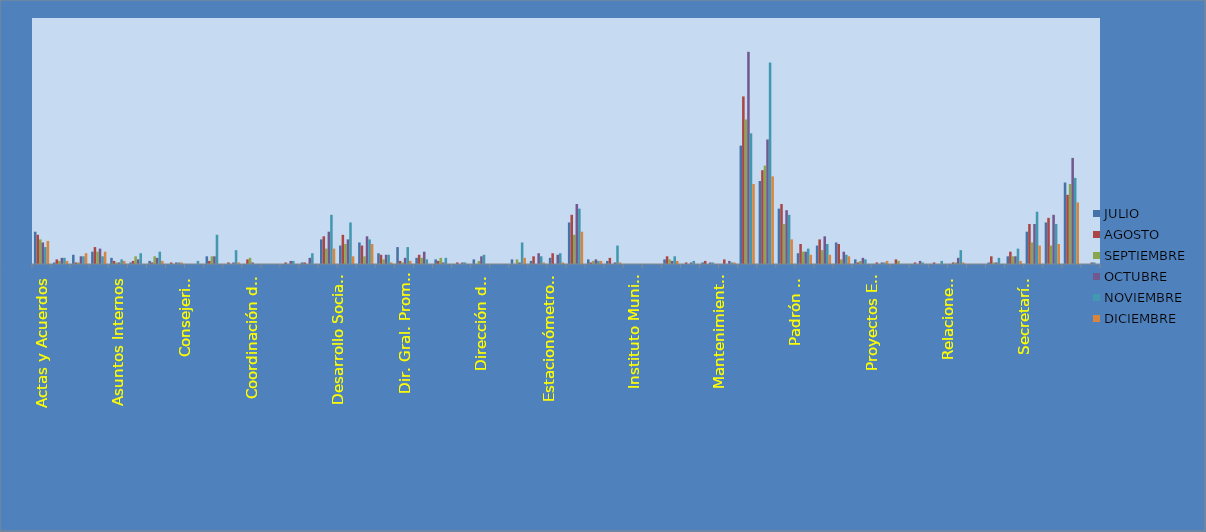
| Category | JULIO | AGOSTO | SEPTIEMBRE | OCTUBRE | NOVIEMBRE | DICIEMBRE |
|---|---|---|---|---|---|---|
| Actas y Acuerdos | 21 | 19 | 16 | 14 | 11 | 15 |
| Agua y Alcantarillado | 1 | 3 | 2 | 4 | 4 | 2 |
| Alumbrado Público | 6 | 1 | 1 | 5 | 5 | 7 |
| Archivo Municipal | 8 | 11 | 8 | 10 | 5 | 8 |
| Asuntos Internos | 4 | 2 | 1 | 1 | 3 | 2 |
| Atención Ciudadana | 1 | 2 | 5 | 3 | 7 | 0 |
| Comunicación Social | 2 | 1 | 5 | 4 | 8 | 2 |
| Comunidad Digna | 0 | 1 | 0 | 1 | 1 | 1 |
| Consejeria Juridica | 0 | 0 | 0 | 0 | 2 | 0 |
| Contraloría | 5 | 2 | 5 | 5 | 19 | 0 |
| Coordinación de Delegaciones | 0 | 1 | 0 | 1 | 9 | 1 |
| Coordinación de Gabinete | 0 | 3 | 4 | 1 | 0 | 0 |
| Coordinación de la Oficina de Presidencia  | 0 | 0 | 0 | 0 | 0 | 0 |
| Coordinación General  Oficina Central de Gobierno, Estrategía y opinión Pública | 0 | 1 | 0 | 2 | 2 | 0 |
| Coplademun | 1 | 1 | 0 | 4 | 7 | 0 |
| Desarrollo Social Humano | 16 | 18 | 10 | 21 | 32 | 10 |
| Dir. General y Admva. Ecología | 12 | 19 | 13 | 16 | 27 | 5 |
| Dir. Gral. de Servicios Públicos | 14 | 12 | 5 | 18 | 16 | 13 |
| Dir. Gral. Innovación y Tecnología | 7 | 6 | 3 | 6 | 6 | 1 |
| Dir. Gral. Promoción Económica y T. | 11 | 2 | 1 | 4 | 11 | 2 |
| Dirección Catastro | 4 | 6 | 4 | 8 | 3 | 0 |
| Dirección de Aseo Público | 3 | 2 | 4 | 1 | 4 | 0 |
| Dirección de Cementerios | 0 | 1 | 0 | 1 | 1 | 0 |
| Dirección de Parques y Jardines | 3 | 0 | 2 | 5 | 6 | 0 |
| Dirección de Protección al Medio Ambiente | 0 | 0 | 0 | 0 | 0 | 0 |
| Dirección de Transparencia y Acceso a la Información | 3 | 0 | 3 | 1 | 14 | 4 |
| Educación Municipal | 2 | 5 | 0 | 7 | 5 | 1 |
| Estacionómetros y Estacionamientos | 4 | 7 | 0 | 6 | 7 | 1 |
| Inspección de Reglamentos | 27 | 32 | 19 | 39 | 36 | 21 |
| Instituto de Capacitación y Oferta Educativa | 3 | 1 | 2 | 3 | 2 | 2 |
| Instituto de Cultura | 2 | 4 | 0 | 1 | 12 | 1 |
| Instituto Municipal de la Juventud | 0 | 0 | 0 | 0 | 0 | 0 |
| Instituto Municipal de la Mujer | 0 | 0 | 0 | 0 | 0 | 0 |
| Integración y Dictaminación | 3 | 5 | 3 | 2 | 5 | 2 |
| Junta Municipal de Reclutamiento | 0 | 1 | 0 | 1 | 2 | 0 |
| Mantenimiento de Pavimentos | 1 | 2 | 0 | 1 | 1 | 0 |
| Mantenimiento Urbano | 0 | 3 | 0 | 2 | 1 | 1 |
| Obras Públicas | 77 | 109 | 94 | 138 | 85 | 52 |
| Oficialía Mayor Administrativa | 54 | 61 | 64 | 81 | 131 | 57 |
| Padrón y Licencias | 36 | 39 | 26 | 35 | 32 | 16 |
| Participación Ciudadana | 7 | 13 | 8 | 8 | 10 | 6 |
| Patrimonio Municipal | 12 | 16 | 9 | 18 | 13 | 6 |
| Protección Civil y Bomberos | 14 | 13 | 3 | 8 | 6 | 5 |
| Proyectos Estratégicos | 3 | 1 | 2 | 4 | 3 | 0 |
| Rastros Municipales | 0 | 1 | 0 | 1 | 1 | 2 |
| Regidores | 0 | 3 | 2 | 0 | 0 | 0 |
| Registro Civil | 0 | 1 | 0 | 2 | 1 | 0 |
| Relaciones Exteriores | 0 | 1 | 0 | 0 | 2 | 0 |
| Relaciones Públicas | 0 | 1 | 1 | 4 | 9 | 1 |
| Sanidad Animal | 0 | 0 | 0 | 0 | 0 | 0 |
| Secretaria del Ayuntamiento | 1 | 5 | 1 | 1 | 4 | 0 |
| Secretaría Particular | 5 | 8 | 5 | 5 | 10 | 2 |
| Seguridad Pública | 21 | 26 | 14 | 26 | 34 | 12 |
| Síndico Municipal | 27 | 30 | 12 | 32 | 26 | 13 |
| Tesorero Municipal | 53 | 45 | 52 | 69 | 56 | 40 |
| Vinculación Asuntos Religiosos | 0 | 0 | 0 | 1 | 1 | 0 |